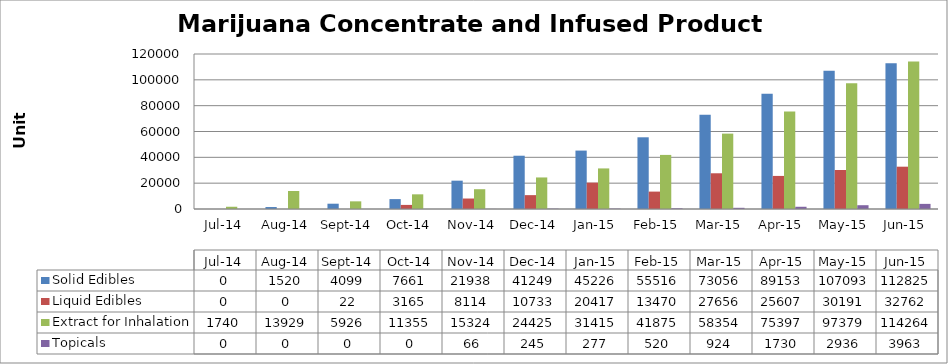
| Category | Solid Edibles | Liquid Edibles | Extract for Inhalation | Topicals |
|---|---|---|---|---|
| 2014-07-01 | 0 | 0 | 1740 | 0 |
| 2014-08-01 | 1520 | 0 | 13929 | 0 |
| 2014-09-01 | 4099 | 22 | 5926 | 0 |
| 2014-10-01 | 7661 | 3165 | 11355 | 0 |
| 2014-11-01 | 21938 | 8114 | 15324 | 66 |
| 2014-12-01 | 41249 | 10733 | 24425 | 245 |
| 2015-01-01 | 45226 | 20417 | 31415 | 277 |
| 2015-02-01 | 55516 | 13470 | 41875 | 520 |
| 2015-03-01 | 73056 | 27656 | 58354 | 924 |
| 2015-04-01 | 89153 | 25607 | 75397 | 1730 |
| 2015-05-01 | 107093 | 30191 | 97379 | 2936 |
| 2015-06-01 | 112825 | 32762 | 114264 | 3963 |